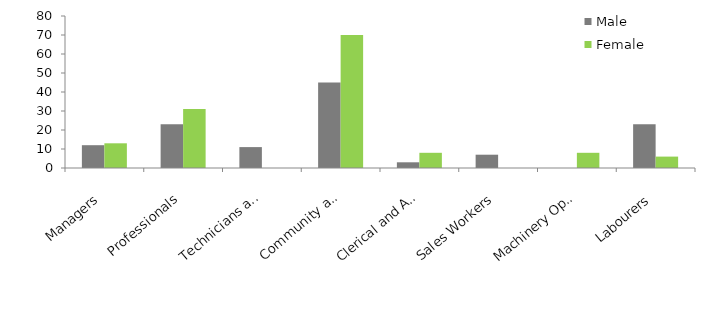
| Category | Male | Female |
|---|---|---|
| Managers | 12 | 13 |
| Professionals | 23 | 31 |
| Technicians and Trades Workers | 11 | 0 |
| Community and Personal Service Workers | 45 | 70 |
| Clerical and Administrative Workers | 3 | 8 |
| Sales Workers | 7 | 0 |
| Machinery Operators and Drivers | 0 | 8 |
| Labourers | 23 | 6 |